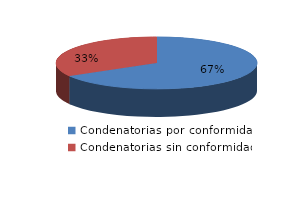
| Category | Series 0 |
|---|---|
| 0 | 7395 |
| 1 | 3708 |